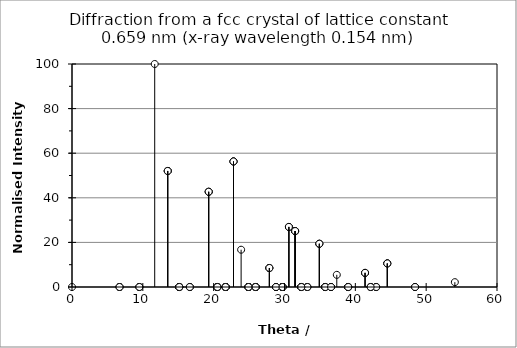
| Category | Series 0 |
|---|---|
| 0.0 | 0 |
| 6.709978439712354 | 0 |
| 13.514262431824092 | 52.039 |
| 20.519803470332043 | 0 |
| 27.86402428486989 | 8.525 |
| 6.709978439712354 | 0 |
| 9.511290053946226 | 0 |
| 15.145460202029952 | 0 |
| 21.684305231007333 | 0 |
| 28.800343479869195 | 0 |
| 13.514262431824092 | 52.039 |
| 15.145460202029952 | 0 |
| 19.29814873694832 | 42.712 |
| 24.9158022249994 | 0 |
| 31.502846466912494 | 25.09 |
| 20.519803470332043 | 0 |
| 21.684305231007333 | 0 |
| 24.9158022249994 | 0 |
| 29.717624878165697 | 0 |
| 35.747800698581095 | 0 |
| 27.86402428486989 | 8.525 |
| 28.800343479869195 | 0 |
| 31.502846466912494 | 25.09 |
| 35.747800698581095 | 0 |
| 41.37372420182965 | 6.346 |
| 6.709978439712354 | 0 |
| 9.511290053946226 | 0 |
| 15.145460202029952 | 0 |
| 21.684305231007333 | 0 |
| 28.800343479869195 | 0 |
| 9.511290053946226 | 0 |
| 11.676124485655766 | 100 |
| 16.631037253855045 | 0 |
| 22.80069201131791 | 56.299 |
| 29.717624878165697 | 0 |
| 15.145460202029952 | 0 |
| 16.631037253855045 | 0 |
| 20.519803470332043 | 0 |
| 25.92467190762787 | 0 |
| 32.374102817569934 | 0 |
| 21.684305231007333 | 0 |
| 22.80069201131791 | 56.299 |
| 25.92467190762787 | 0 |
| 30.61787290448273 | 26.942 |
| 36.56885003201428 | 0 |
| 28.800343479869195 | 0 |
| 29.717624878165697 | 0 |
| 32.374102817569934 | 0 |
| 36.56885003201428 | 0 |
| 42.160983402125304 | 0 |
| 13.514262431824092 | 52.039 |
| 15.145460202029952 | 0 |
| 19.29814873694832 | 42.712 |
| 24.9158022249994 | 0 |
| 31.502846466912494 | 25.09 |
| 15.145460202029952 | 0 |
| 16.631037253855045 | 0 |
| 20.519803470332043 | 0 |
| 25.92467190762787 | 0 |
| 32.374102817569934 | 0 |
| 19.29814873694832 | 42.712 |
| 20.519803470332043 | 0 |
| 23.875991815516066 | 16.724 |
| 28.800343479869195 | 0 |
| 34.918796472883564 | 19.396 |
| 24.9158022249994 | 0 |
| 25.92467190762787 | 0 |
| 28.800343479869195 | 0 |
| 33.23303217556015 | 0 |
| 38.99279027122686 | 0 |
| 31.502846466912494 | 25.09 |
| 32.374102817569934 | 0 |
| 34.918796472883564 | 19.396 |
| 38.99279027122686 | 0 |
| 44.51228794264627 | 10.572 |
| 20.519803470332043 | 0 |
| 21.684305231007333 | 0 |
| 24.9158022249994 | 0 |
| 29.717624878165697 | 0 |
| 35.747800698581095 | 0 |
| 21.684305231007333 | 0 |
| 22.80069201131791 | 56.299 |
| 25.92467190762787 | 0 |
| 30.61787290448273 | 26.942 |
| 36.56885003201428 | 0 |
| 24.9158022249994 | 0 |
| 25.92467190762787 | 0 |
| 28.800343479869195 | 0 |
| 33.23303217556015 | 0 |
| 38.99279027122686 | 0 |
| 29.717624878165697 | 0 |
| 30.61787290448273 | 26.942 |
| 33.23303217556015 | 0 |
| 37.38282570397467 | 5.452 |
| 42.94609677060287 | 0 |
| 35.747800698581095 | 0 |
| 36.56885003201428 | 0 |
| 38.99279027122686 | 0 |
| 42.94609677060287 | 0 |
| 48.431651462574685 | 0 |
| 27.86402428486989 | 8.525 |
| 28.800343479869195 | 0 |
| 31.502846466912494 | 25.09 |
| 35.747800698581095 | 0 |
| 41.37372420182965 | 6.346 |
| 28.800343479869195 | 0 |
| 29.717624878165697 | 0 |
| 32.374102817569934 | 0 |
| 36.56885003201428 | 0 |
| 42.160983402125304 | 0 |
| 31.502846466912494 | 25.09 |
| 32.374102817569934 | 0 |
| 34.918796472883564 | 19.396 |
| 38.99279027122686 | 0 |
| 44.51228794264627 | 10.572 |
| 35.747800698581095 | 0 |
| 36.56885003201428 | 0 |
| 38.99279027122686 | 0 |
| 42.94609677060287 | 0 |
| 48.431651462574685 | 0 |
| 41.37372420182965 | 6.346 |
| 42.160983402125304 | 0 |
| 44.51228794264627 | 10.572 |
| 48.431651462574685 | 0 |
| 54.04875978489639 | 2.169 |